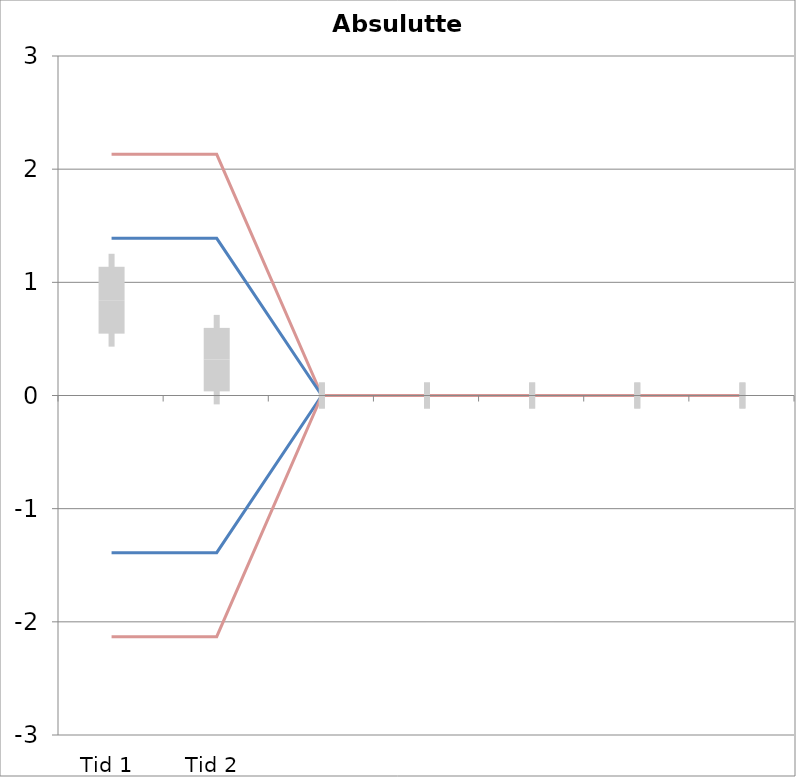
| Category | 1 | 2 | 3 | 4 | 5 | 6 | 7 | 8 | 9 | 10 | 11 | 12 | 13 | 14 | 15 | 16 | 17 | 18 | 19 | 20 | TEa | B | -B | -TEa | M |
|---|---|---|---|---|---|---|---|---|---|---|---|---|---|---|---|---|---|---|---|---|---|---|---|---|---|
| Tid 1 | 0.98 | 0.42 | 0.96 | 0.78 | 0.51 | 0.48 | 1.64 | 0.79 | 0.47 | 1.39 | 0 | 0 | 0 | 0 | 0 | 0 | 0 | 0 | 0 | 0 | 2.131 | 1.389 | -1.389 | -2.131 | 0.842 |
| Tid 2 | -0.1 | 0.32 | 0.57 | 0.31 | 0.48 | -0.12 | 0.66 | 0.36 | -0.29 | 0.98 | 0 | 0 | 0 | 0 | 0 | 0 | 0 | 0 | 0 | 0 | 2.131 | 1.389 | -1.389 | -2.131 | 0.317 |